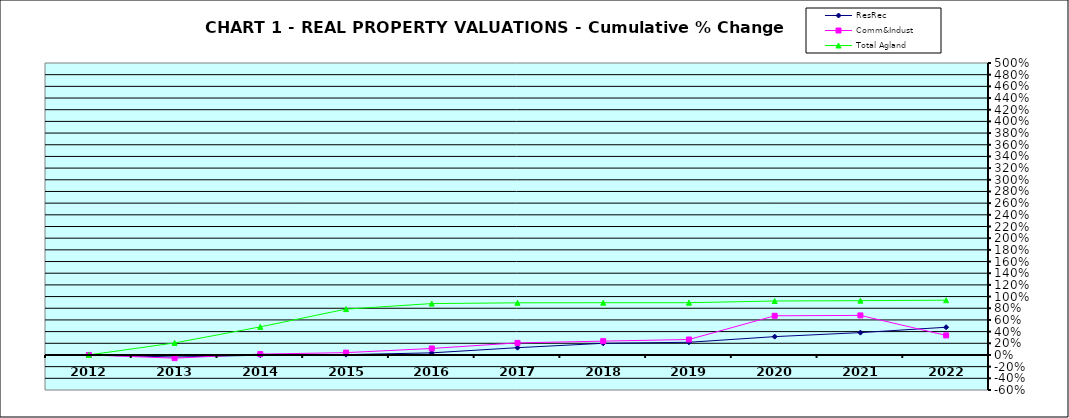
| Category | ResRec | Comm&Indust | Total Agland |
|---|---|---|---|
| 2012.0 | 0 | 0 | 0 |
| 2013.0 | -0.035 | -0.055 | 0.206 |
| 2014.0 | -0.004 | 0.015 | 0.481 |
| 2015.0 | 0.005 | 0.04 | 0.785 |
| 2016.0 | 0.036 | 0.111 | 0.88 |
| 2017.0 | 0.125 | 0.207 | 0.893 |
| 2018.0 | 0.2 | 0.237 | 0.895 |
| 2019.0 | 0.217 | 0.265 | 0.895 |
| 2020.0 | 0.314 | 0.671 | 0.924 |
| 2021.0 | 0.383 | 0.677 | 0.93 |
| 2022.0 | 0.475 | 0.335 | 0.938 |